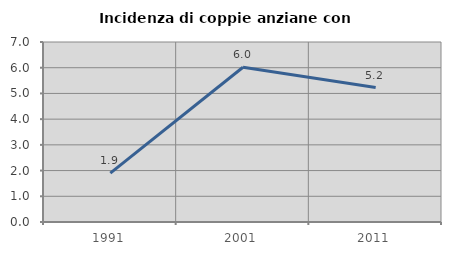
| Category | Incidenza di coppie anziane con figli |
|---|---|
| 1991.0 | 1.903 |
| 2001.0 | 6.019 |
| 2011.0 | 5.229 |